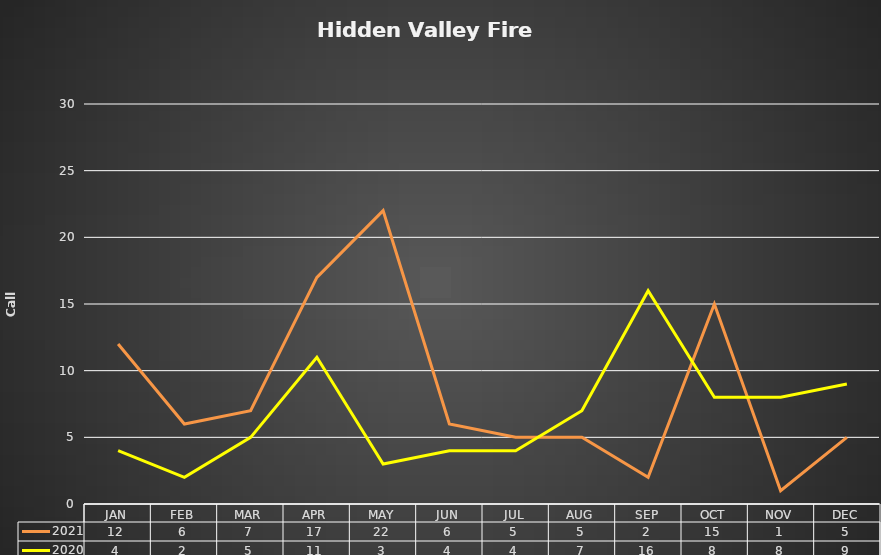
| Category | 2021 | 2020 |
|---|---|---|
| JAN | 12 | 4 |
| FEB | 6 | 2 |
| MAR | 7 | 5 |
| APR | 17 | 11 |
| MAY | 22 | 3 |
| JUN | 6 | 4 |
| JUL | 5 | 4 |
| AUG | 5 | 7 |
| SEP | 2 | 16 |
| OCT | 15 | 8 |
| NOV | 1 | 8 |
| DEC | 5 | 9 |